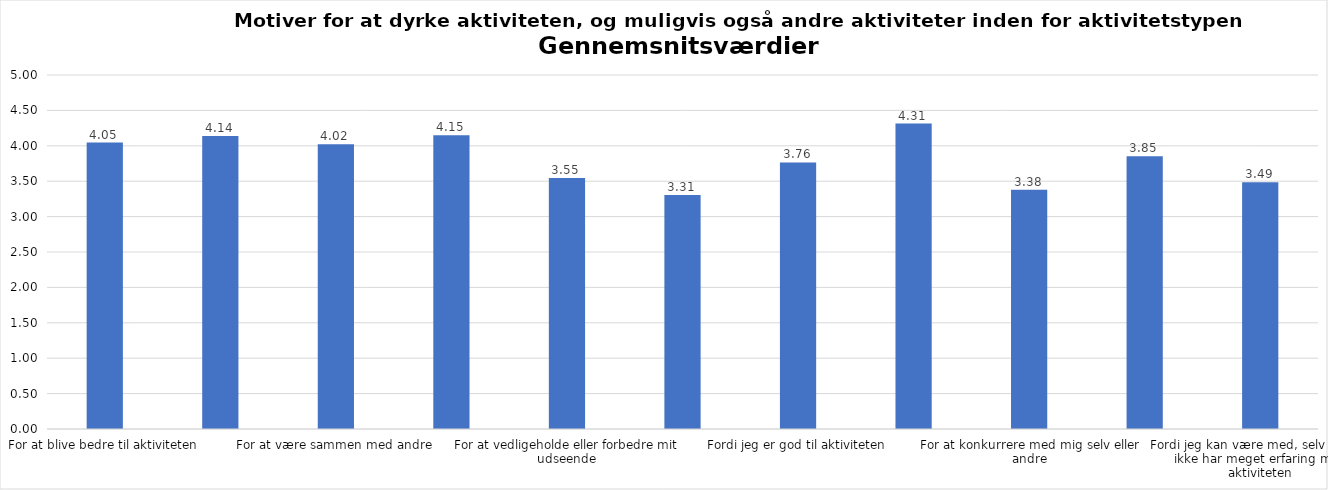
| Category | Gennemsnit |
|---|---|
| For at blive bedre til aktiviteten | 4.046 |
| For at vedligeholde eller forbedre min sundhed (fx helbred, fysisk form) | 4.137 |
| For at være sammen med andre | 4.024 |
| For at gøre noget godt for mig selv | 4.151 |
| For at vedligeholde eller forbedre mit udseende | 3.545 |
| Fordi andre i min omgangskreds opmuntrer mig til det | 3.306 |
| Fordi jeg er god til aktiviteten | 3.764 |
| Fordi jeg godt kan lide aktiviteten | 4.314 |
| For at konkurrere med mig selv eller andre | 3.38 |
| Fordi aktiviteten passer godt ind i min hverdag | 3.852 |
| Fordi jeg kan være med, selv om jeg ikke har meget erfaring med aktiviteten | 3.487 |